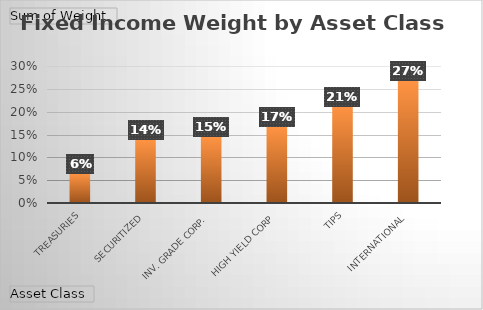
| Category | Total |
|---|---|
| Treasuries | 0.065 |
| Securitized | 0.14 |
| Inv. Grade Corp. | 0.146 |
| High Yield Corp | 0.168 |
| TIPS | 0.213 |
| International | 0.269 |